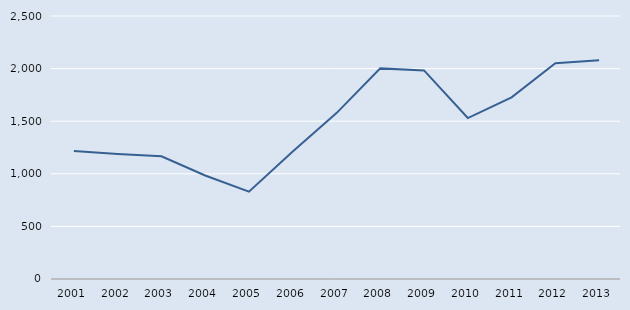
| Category | Series 0 |
|---|---|
| 2001.0 | 1216 |
| 2002.0 | 1189 |
| 2003.0 | 1166 |
| 2004.0 | 984 |
| 2005.0 | 830 |
| 2006.0 | 1211 |
| 2007.0 | 1577 |
| 2008.0 | 2002 |
| 2009.0 | 1983 |
| 2010.0 | 1530 |
| 2011.0 | 1727 |
| 2012.0 | 2051 |
| 2013.0 | 2079 |